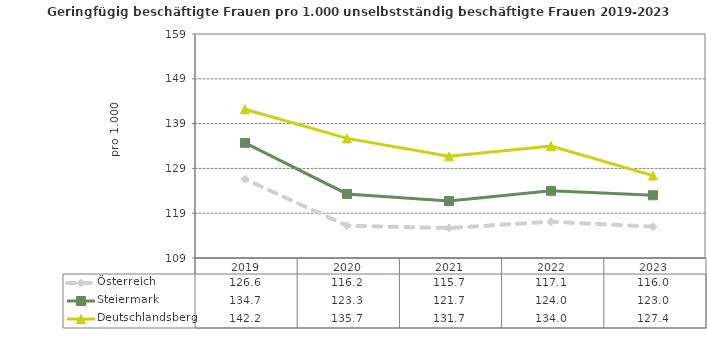
| Category | Österreich | Steiermark | Deutschlandsberg |
|---|---|---|---|
| 2023.0 | 116 | 123 | 127.4 |
| 2022.0 | 117.1 | 124 | 134 |
| 2021.0 | 115.7 | 121.7 | 131.7 |
| 2020.0 | 116.2 | 123.3 | 135.7 |
| 2019.0 | 126.6 | 134.7 | 142.2 |